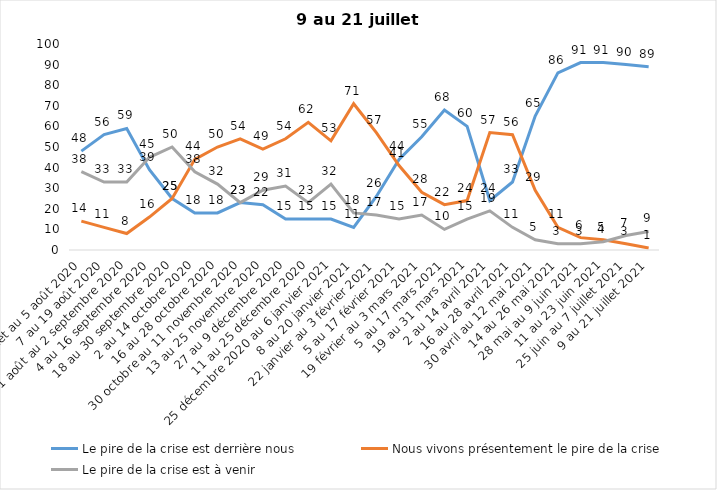
| Category | Le pire de la crise est derrière nous | Nous vivons présentement le pire de la crise | Le pire de la crise est à venir |
|---|---|---|---|
| 24 juillet au 5 août 2020 | 48 | 14 | 38 |
| 7 au 19 août 2020 | 56 | 11 | 33 |
| 21 août au 2 septembre 2020 | 59 | 8 | 33 |
| 4 au 16 septembre 2020 | 39 | 16 | 45 |
| 18 au 30 septembre 2020 | 25 | 25 | 50 |
| 2 au 14 octobre 2020 | 18 | 44 | 38 |
| 16 au 28 octobre 2020 | 18 | 50 | 32 |
| 30 octobre au 11 novembre 2020 | 23 | 54 | 23 |
| 13 au 25 novembre 2020 | 22 | 49 | 29 |
| 27 au 9 décembre 2020 | 15 | 54 | 31 |
| 11 au 25 décembre 2020 | 15 | 62 | 23 |
| 25 décembre 2020 au 6 janvier 2021 | 15 | 53 | 32 |
| 8 au 20 janvier 2021 | 11 | 71 | 18 |
| 22 janvier au 3 février 2021 | 26 | 57 | 17 |
| 5 au 17 février 2021 | 44 | 41 | 15 |
| 19 février au 3 mars 2021 | 55 | 28 | 17 |
| 5 au 17 mars 2021 | 68 | 22 | 10 |
| 19 au 31 mars 2021 | 60 | 24 | 15 |
| 2 au 14 avril 2021 | 24 | 57 | 19 |
| 16 au 28 avril 2021 | 33 | 56 | 11 |
| 30 avril au 12 mai 2021 | 65 | 29 | 5 |
| 14 au 26 mai 2021 | 86 | 11 | 3 |
| 28 mai au 9 juin 2021 | 91 | 6 | 3 |
| 11 au 23 juin 2021 | 91 | 5 | 4 |
| 25 juin au 7 juillet 2021 | 90 | 3 | 7 |
| 9 au 21 juillet 2021 | 89 | 1 | 9 |